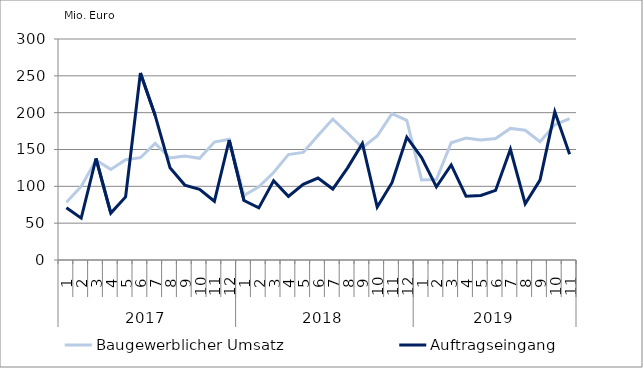
| Category | Baugewerblicher Umsatz | Auftragseingang |
|---|---|---|
| 0 | 78446.78 | 70908.903 |
| 1 | 99841.908 | 56868.408 |
| 2 | 135679.867 | 137790.423 |
| 3 | 123004.403 | 63637.761 |
| 4 | 136010.071 | 85644.63 |
| 5 | 138859.308 | 253791.552 |
| 6 | 158353.879 | 196034.198 |
| 7 | 138510.315 | 125319.873 |
| 8 | 141109.925 | 101690.626 |
| 9 | 138067.098 | 95966.626 |
| 10 | 160064.454 | 79701.993 |
| 11 | 163969.017 | 162878.607 |
| 12 | 87640.529 | 80684.627 |
| 13 | 99259.455 | 70746.763 |
| 14 | 118764.324 | 107538.747 |
| 15 | 143144.178 | 86374.619 |
| 16 | 146070.782 | 102661.329 |
| 17 | 169150.753 | 111287.709 |
| 18 | 191277.885 | 96286.662 |
| 19 | 172425.535 | 125142.495 |
| 20 | 152354.98 | 158112.302 |
| 21 | 168372.756 | 71808.619 |
| 22 | 198558.472 | 104904.147 |
| 23 | 189665.914 | 166653.461 |
| 24 | 108616.605 | 139065.287 |
| 25 | 109331.58 | 99318.609 |
| 26 | 159117.81 | 129002.041 |
| 27 | 165654.287 | 86579.2 |
| 28 | 162976.056 | 87644.362 |
| 29 | 165026.188 | 94463.186 |
| 30 | 178622.938 | 150345.08 |
| 31 | 176074.101 | 76434.317 |
| 32 | 160663.041 | 108444.162 |
| 33 | 183589.485 | 201122.697 |
| 34 | 191777.213 | 143514.792 |